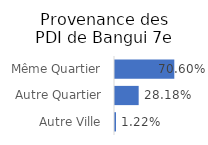
| Category | Provenance des PDI |
|---|---|
| Autre Ville | 0.012 |
| Autre Quartier | 0.282 |
| Même Quartier | 0.706 |